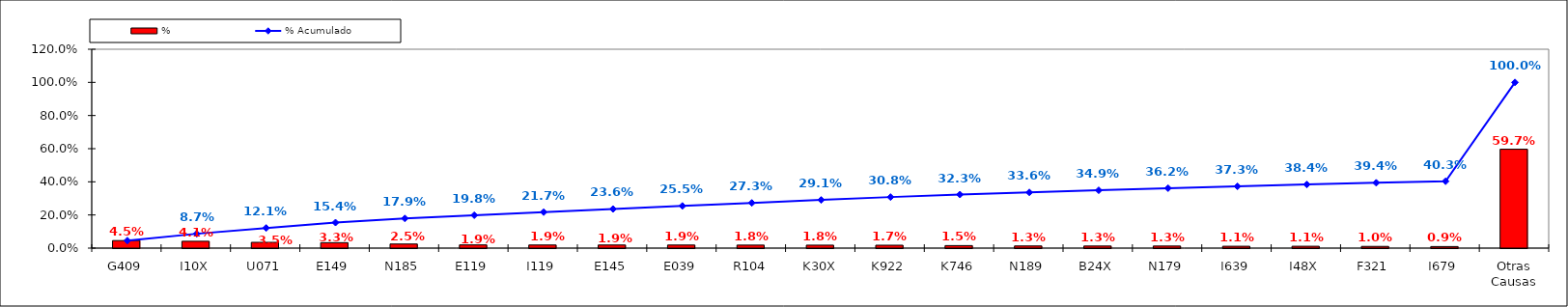
| Category | % |
|---|---|
| G409 | 0.045 |
| I10X | 0.041 |
| U071 | 0.035 |
| E149 | 0.033 |
| N185 | 0.025 |
| E119 | 0.019 |
| I119 | 0.019 |
| E145 | 0.019 |
| E039 | 0.019 |
| R104 | 0.018 |
| K30X | 0.018 |
| K922 | 0.017 |
| K746 | 0.015 |
| N189 | 0.013 |
| B24X | 0.013 |
| N179 | 0.013 |
| I639 | 0.011 |
| I48X | 0.011 |
| F321 | 0.01 |
| I679 | 0.009 |
| Otras Causas | 0.597 |